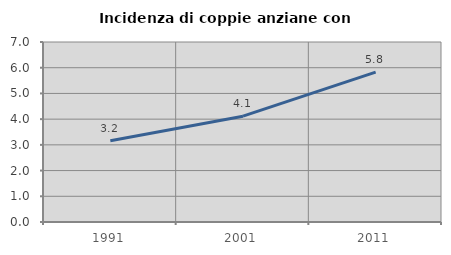
| Category | Incidenza di coppie anziane con figli |
|---|---|
| 1991.0 | 3.161 |
| 2001.0 | 4.116 |
| 2011.0 | 5.827 |